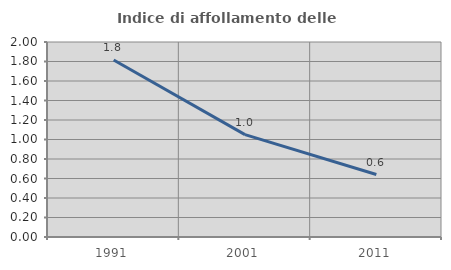
| Category | Indice di affollamento delle abitazioni  |
|---|---|
| 1991.0 | 1.815 |
| 2001.0 | 1.049 |
| 2011.0 | 0.641 |